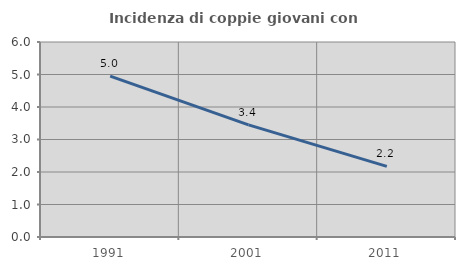
| Category | Incidenza di coppie giovani con figli |
|---|---|
| 1991.0 | 4.95 |
| 2001.0 | 3.448 |
| 2011.0 | 2.174 |